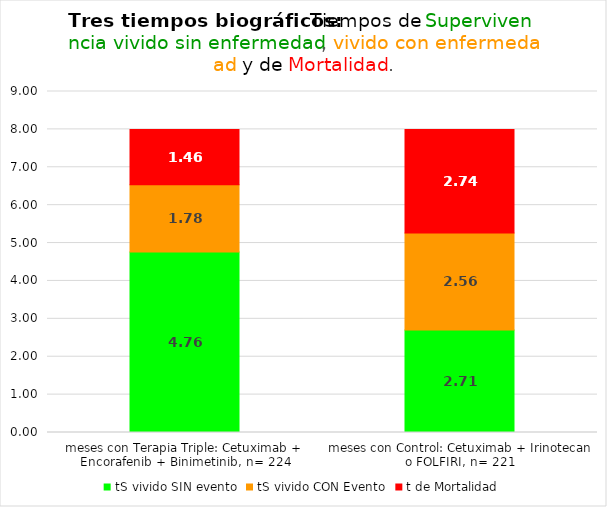
| Category | tS vivido SIN evento | tS vivido CON Evento | t de Mortalidad |
|---|---|---|---|
| meses con Terapia Triple: Cetuximab + Encorafenib + Binimetinib, n= 224 | 4.765 | 1.776 | 1.459 |
| meses con Control: Cetuximab + Irinotecan o FOLFIRI, n= 221 | 2.706 | 2.557 | 2.738 |